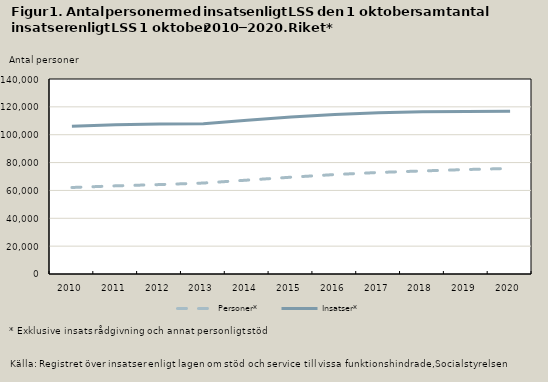
| Category | Personer* | Insatser* |
|---|---|---|
| 2010.0 | 62100 | 106000 |
| 2011.0 | 63300 | 107100 |
| 2012.0 | 64200 | 107700 |
| 2013.0 | 65300 | 107900 |
| 2014.0 | 67400 | 110300 |
| 2015.0 | 69500 | 112800 |
| 2016.0 | 71400 | 114500 |
| 2017.0 | 72900 | 115800 |
| 2018.0 | 74000 | 116500 |
| 2019.0 | 75000 | 116700 |
| 2020.0 | 75800 | 116900 |